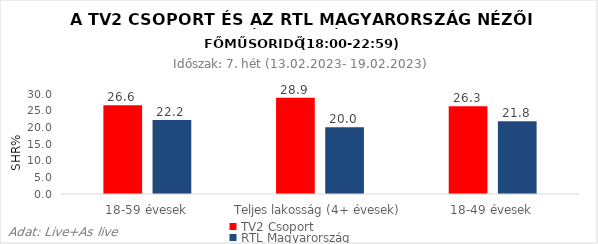
| Category | TV2 Csoport | RTL Magyarország |
|---|---|---|
| 18-59 évesek | 26.6 | 22.2 |
| Teljes lakosság (4+ évesek) | 28.9 | 20 |
| 18-49 évesek | 26.3 | 21.8 |